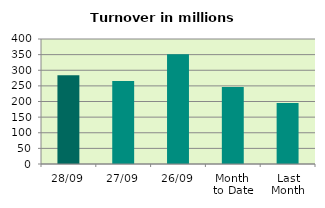
| Category | Series 0 |
|---|---|
| 28/09 | 283.897 |
| 27/09 | 265.509 |
| 26/09 | 351.547 |
| Month 
to Date | 246.201 |
| Last
Month | 195.366 |